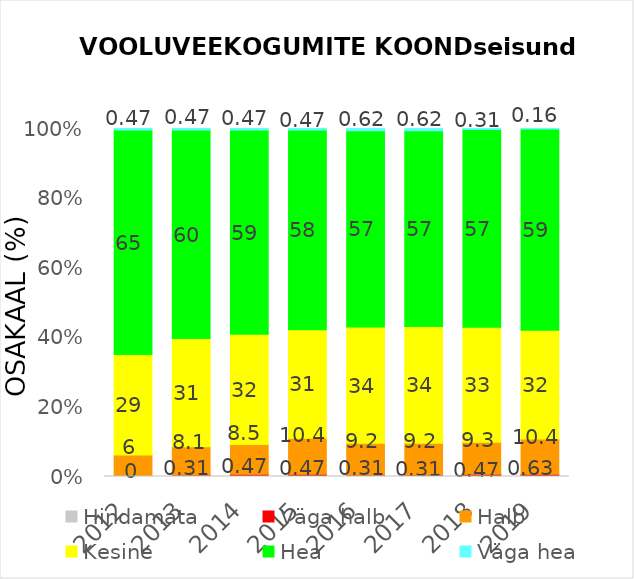
| Category | Hindamata | Väga halb | Halb | Kesine | Hea | Väga hea |
|---|---|---|---|---|---|---|
| 2012.0 | 0.155 | 0 | 6.056 | 29.037 | 64.907 | 0.466 |
| 2013.0 | 0.155 | 0.311 | 8.075 | 31.211 | 60.093 | 0.466 |
| 2014.0 | 0.155 | 0.466 | 8.54 | 31.677 | 58.54 | 0.466 |
| 2015.0 | 0.155 | 0.466 | 10.404 | 31.366 | 57.609 | 0.466 |
| 2016.0 | 0.155 | 0.311 | 9.161 | 33.696 | 56.832 | 0.621 |
| 2017.0 | 0.155 | 0.311 | 9.161 | 33.696 | 56.522 | 0.621 |
| 2018.0 | 0.155 | 0.466 | 9.317 | 33.385 | 57.453 | 0.311 |
| 2019.0 | 0 | 0.63 | 10.394 | 31.969 | 59.213 | 0.157 |